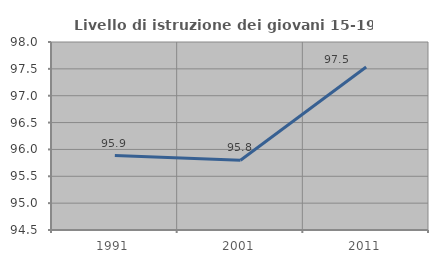
| Category | Livello di istruzione dei giovani 15-19 anni |
|---|---|
| 1991.0 | 95.886 |
| 2001.0 | 95.798 |
| 2011.0 | 97.535 |